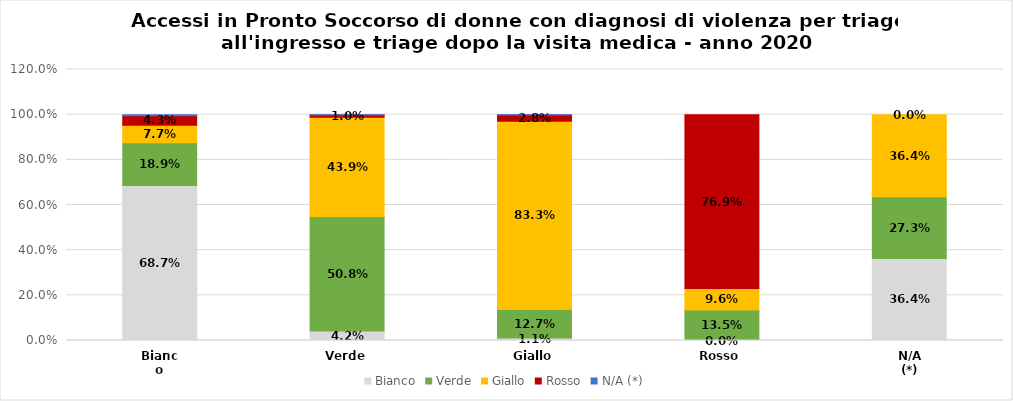
| Category | Bianco | Verde | Giallo | Rosso | N/A (*) |
|---|---|---|---|---|---|
| Bianco | 0.687 | 0.189 | 0.077 | 0.043 | 0.004 |
| Verde | 0.042 | 0.508 | 0.439 | 0.01 | 0.002 |
| Giallo | 0.011 | 0.127 | 0.833 | 0.028 | 0.002 |
| Rosso | 0 | 0.135 | 0.096 | 0.769 | 0 |
| N/A (*) | 0.364 | 0.273 | 0.364 | 0 | 0 |